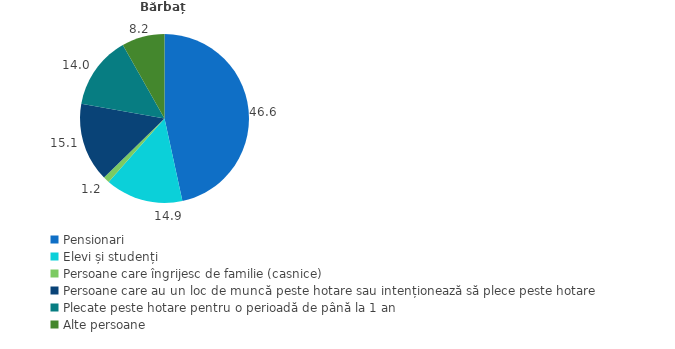
| Category | Bărbați |
|---|---|
| Pensionari | 46.6 |
| Elevi și studenți | 14.9 |
| Persoane care îngrijesc de familie (casnice) | 1.2 |
| Persoane care au un loc de muncă peste hotare sau intenționează să plece peste hotare | 15.1 |
| Plecate peste hotare pentru o perioadă de până la 1 an | 14 |
| Alte persoane | 8.2 |